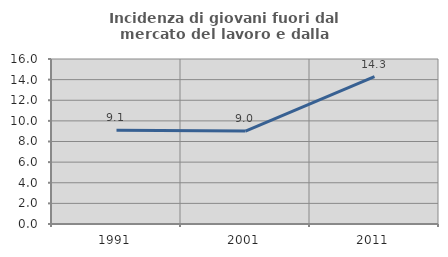
| Category | Incidenza di giovani fuori dal mercato del lavoro e dalla formazione  |
|---|---|
| 1991.0 | 9.091 |
| 2001.0 | 9.009 |
| 2011.0 | 14.286 |